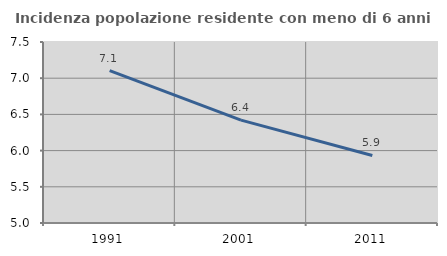
| Category | Incidenza popolazione residente con meno di 6 anni |
|---|---|
| 1991.0 | 7.105 |
| 2001.0 | 6.421 |
| 2011.0 | 5.933 |